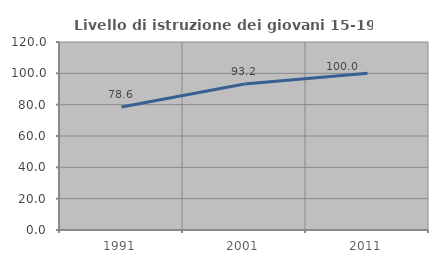
| Category | Livello di istruzione dei giovani 15-19 anni |
|---|---|
| 1991.0 | 78.571 |
| 2001.0 | 93.182 |
| 2011.0 | 100 |